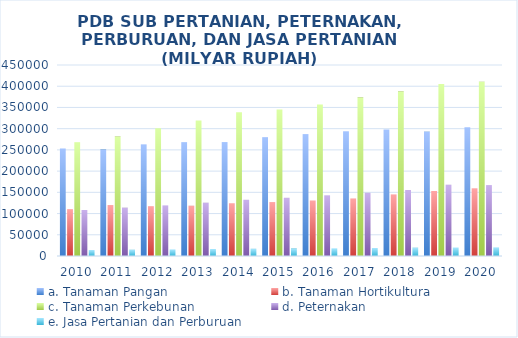
| Category | a. Tanaman Pangan | b. Tanaman Hortikultura | c. Tanaman Perkebunan | d. Peternakan | e. Jasa Pertanian dan Perburuan |
|---|---|---|---|---|---|
| 2010 | 253326.6 | 110395.3 | 268207.3 | 108399.9 | 14105.3 |
| 2011 | 250787.4 | 120079.3 | 281465 | 113603.3 | 14646.1 |
| 2012 | 263076.2 | 117424.5 | 301019.5 | 119249.8 | 15534.4 |
| 2013 | 268268.2 | 118207.7 | 319532.6 | 125302.3 | 16452.9 |
| 2014 | 268426.9 | 124300.9 | 338502.2 | 132221.1 | 16938.4 |
| 2015 | 280018.8 | 127110 | 345164.9 | 136936.4 | 17575.4 |
| 2016 | 287216.5 | 130832.3 | 357137.7 | 143036.5 | 18133.9 |
| 2017 | 293858 | 135649 | 373194.2 | 148688.8 | 18872.9 |
| 2018 | 298027.3 | 145131.2 | 387496.7 | 155539.9 | 19459.9 |
| 2019 | 292883 | 153157.8 | 405147.5 | 167637.9 | 20076.7 |
| 2020 | 303247.4 | 159539.3 | 410553.4 | 167084.8 | 20398.2 |